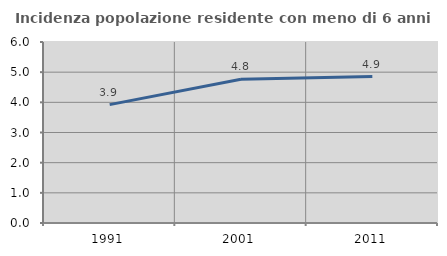
| Category | Incidenza popolazione residente con meno di 6 anni |
|---|---|
| 1991.0 | 3.924 |
| 2001.0 | 4.764 |
| 2011.0 | 4.855 |